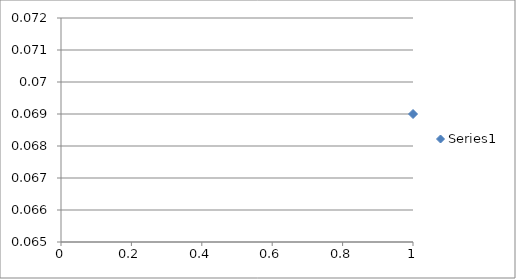
| Category | Series 0 |
|---|---|
| 0 | 0.069 |
| 1 | 0.07 |
| 2 | 0.071 |
| 3 | 0.071 |
| 4 | 0.071 |
| 5 | 0.07 |
| 6 | 0.069 |
| 7 | 0.068 |
| 8 | 0.067 |
| 9 | 0.066 |
| 10 | 0.067 |
| 11 | 0.068 |
| 12 | 0.068 |